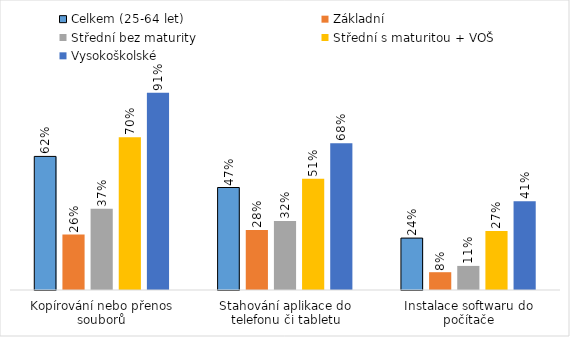
| Category | Celkem (25-64 let) | Základní | Střední bez maturity | Střední s maturitou + VOŠ | Vysokoškolské |
|---|---|---|---|---|---|
| Kopírování nebo přenos souborů | 0.616 | 0.255 | 0.375 | 0.704 | 0.909 |
| Stahování aplikace do telefonu či tabletu | 0.472 | 0.277 | 0.318 | 0.513 | 0.676 |
| Instalace softwaru do počítače | 0.239 | 0.082 | 0.111 | 0.272 | 0.409 |